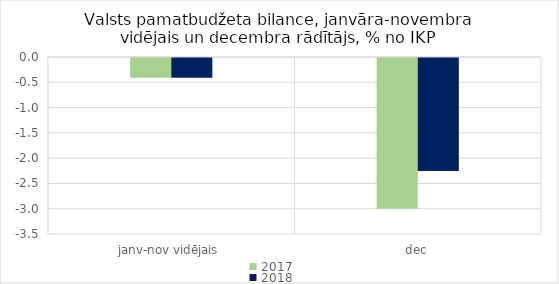
| Category | 2017 | 2018 |
|---|---|---|
| janv-nov vidējais | -0.388 | -0.388 |
| dec | -2.981 | -2.236 |